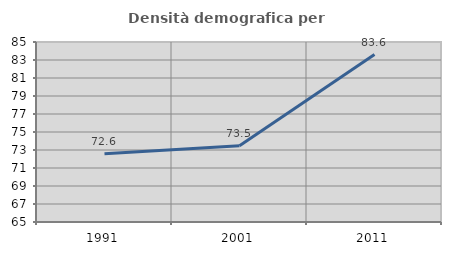
| Category | Densità demografica |
|---|---|
| 1991.0 | 72.571 |
| 2001.0 | 73.476 |
| 2011.0 | 83.611 |